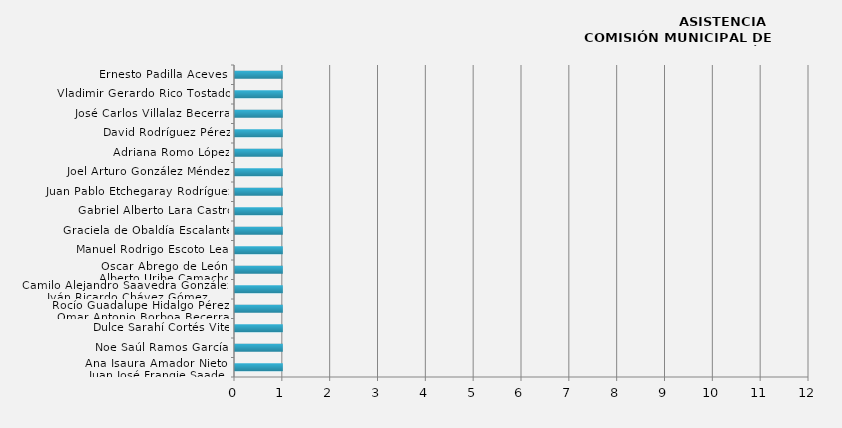
| Category | Series 0 |
|---|---|
| Ana Isaura Amador Nieto/
Juan José Frangie Saade | 1 |
| Noe Saúl Ramos García  | 1 |
| Dulce Sarahí Cortés Vite | 1 |
| Rocío Guadalupe Hidalgo Pérez/
Omar Antonio Borboa Becerra | 1 |
| Camilo Alejandro Saavedra González/
Iván Ricardo Chávez Gómez | 1 |
| Oscar Abrego de León/
Alberto Uribe Camacho | 1 |
| Manuel Rodrigo Escoto Leal | 1 |
| Graciela de Obaldía Escalante | 1 |
| Gabriel Alberto Lara Castro | 1 |
| Juan Pablo Etchegaray Rodríguez | 1 |
| Joel Arturo González Méndez  | 1 |
| Adriana Romo López | 1 |
| David Rodríguez Pérez | 1 |
| José Carlos Villalaz Becerra  | 1 |
| Vladimir Gerardo Rico Tostado  | 1 |
| Ernesto Padilla Aceves  | 1 |